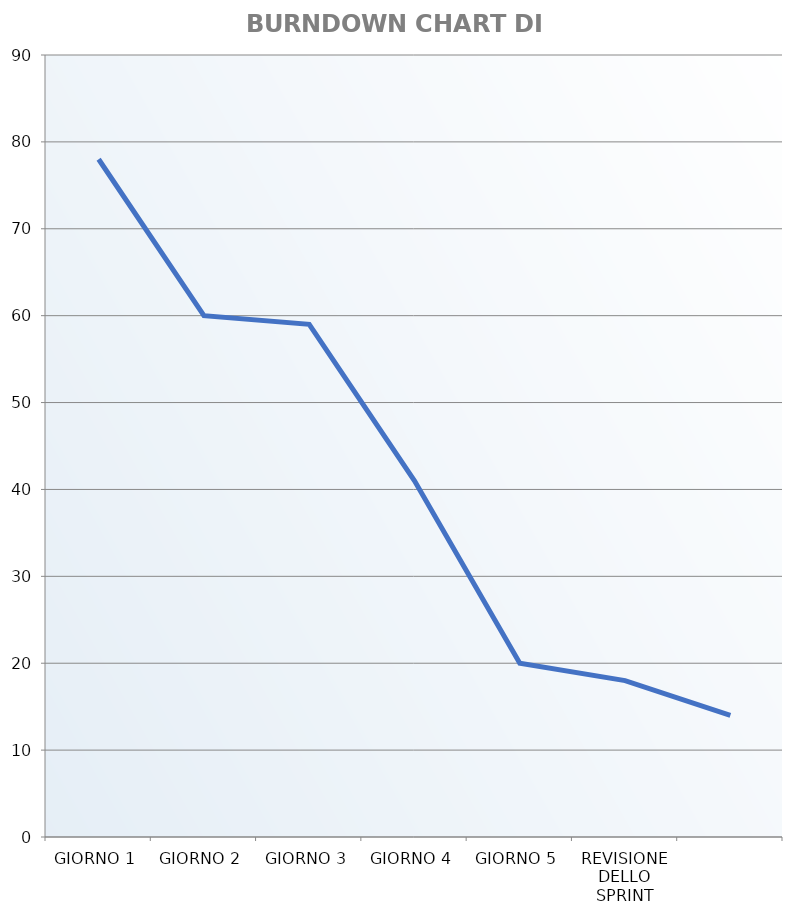
| Category | Burndown Chart di Sprint |
|---|---|
| GIORNO 1 | 78 |
| GIORNO 2 | 60 |
| GIORNO 3 | 59 |
| GIORNO 4 | 41 |
| GIORNO 5 | 20 |
| REVISIONE DELLO SPRINT | 18 |